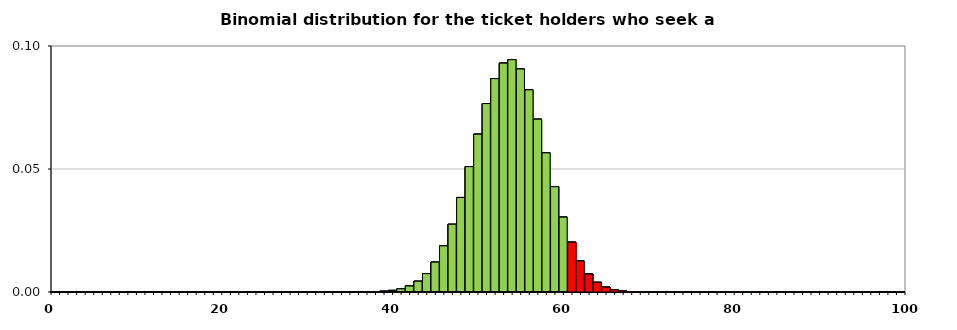
| Category | get their parking lot | 0,670 | 80 | 0,048 |
|---|---|---|---|---|
| 0.0 | 0 | 0 | 0 | -1 |
| 1.0 | 0 | 0 | 0 | -1 |
| 2.0 | 0 | 0 | 0 | -1 |
| 3.0 | 0 | 0 | 0 | -1 |
| 4.0 | 0 | 0 | 0 | -1 |
| 5.0 | 0 | 0 | 0 | -1 |
| 6.0 | 0 | 0 | 0 | -1 |
| 7.0 | 0 | 0 | 0 | -1 |
| 8.0 | 0 | 0 | 0 | -1 |
| 9.0 | 0 | 0 | 0 | -1 |
| 10.0 | 0 | 0 | 0 | -1 |
| 11.0 | 0 | 0 | 0 | -1 |
| 12.0 | 0 | 0 | 0 | -1 |
| 13.0 | 0 | 0 | 0 | -1 |
| 14.0 | 0 | 0 | 0 | -1 |
| 15.0 | 0 | 0 | 0 | -1 |
| 16.0 | 0 | 0 | 0 | -1 |
| 17.0 | 0 | 0 | 0 | -1 |
| 18.0 | 0 | 0 | 0 | -1 |
| 19.0 | 0 | 0 | 0 | -1 |
| 20.0 | 0 | 0 | 0 | -1 |
| 21.0 | 0 | 0 | 0 | -1 |
| 22.0 | 0 | 0 | 0 | -1 |
| 23.0 | 0 | 0 | 0 | -1 |
| 24.0 | 0 | 0 | 0 | -1 |
| 25.0 | 0 | 0 | 0 | -1 |
| 26.0 | 0 | 0 | 0 | -1 |
| 27.0 | 0 | 0 | 0 | -1 |
| 28.0 | 0 | 0 | 0 | -1 |
| 29.0 | 0 | 0 | 0 | -1 |
| 30.0 | 0 | 0 | 0 | -1 |
| 31.0 | 0 | 0 | 0 | -1 |
| 32.0 | 0 | 0 | 0 | -1 |
| 33.0 | 0 | 0 | 0 | -1 |
| 34.0 | 0 | 0 | 0 | -1 |
| 35.0 | 0 | 0 | 0 | -1 |
| 36.0 | 0 | 0 | 0 | -1 |
| 37.0 | 0 | 0 | 0 | -1 |
| 38.0 | 0 | 0 | 0 | -1 |
| 39.0 | 0 | 0 | 0 | -1 |
| 40.0 | 0.001 | 0 | 0 | -1 |
| 41.0 | 0.001 | 0 | 0 | -1 |
| 42.0 | 0.002 | 0 | 0 | -1 |
| 43.0 | 0.004 | 0 | 0 | -1 |
| 44.0 | 0.007 | 0 | 0 | -1 |
| 45.0 | 0.012 | 0 | 0 | -1 |
| 46.0 | 0.019 | 0 | 0 | -1 |
| 47.0 | 0.028 | 0 | 0 | -1 |
| 48.0 | 0.038 | 0 | 0 | -1 |
| 49.0 | 0.051 | 0 | 0 | -1 |
| 50.0 | 0.064 | 0 | 0 | -1 |
| 51.0 | 0.077 | 0 | 0 | -1 |
| 52.0 | 0.087 | 0 | 0 | -1 |
| 53.0 | 0.093 | 0 | 0 | -1 |
| 54.0 | 0.094 | 0 | 0 | -1 |
| 55.0 | 0.091 | 0 | 0 | -1 |
| 56.0 | 0.082 | 0 | 0 | -1 |
| 57.0 | 0.07 | 0 | 0 | -1 |
| 58.0 | 0.057 | 0 | 0 | -1 |
| 59.0 | 0.043 | 0 | 0 | -1 |
| 60.0 | 0.03 | 0 | 0 | -1 |
| 61.0 | -1 | 0 | 0 | 0.02 |
| 62.0 | -1 | 0 | 0 | 0.013 |
| 63.0 | -1 | 0 | 0 | 0.007 |
| 64.0 | -1 | 0 | 0 | 0.004 |
| 65.0 | -1 | 0 | 0 | 0.002 |
| 66.0 | -1 | 0 | 0 | 0.001 |
| 67.0 | -1 | 0 | 0 | 0 |
| 68.0 | -1 | 0 | 0 | 0 |
| 69.0 | -1 | 0 | 0 | 0 |
| 70.0 | -1 | 0 | 0 | 0 |
| 71.0 | -1 | 0 | 0 | 0 |
| 72.0 | -1 | 0 | 0 | 0 |
| 73.0 | -1 | 0 | 0 | 0 |
| 74.0 | -1 | 0 | 0 | 0 |
| 75.0 | -1 | 0 | 0 | 0 |
| 76.0 | -1 | 0 | 0 | 0 |
| 77.0 | -1 | 0 | 0 | 0 |
| 78.0 | -1 | 0 | 0 | 0 |
| 79.0 | -1 | 0 | 0 | 0 |
| 80.0 | -1 | 0 | 0 | 0 |
| 81.0 | -1 | 0 | 0 | 0 |
| 82.0 | -1 | 0 | 0 | 0 |
| 83.0 | -1 | 0 | 0 | 0 |
| 84.0 | -1 | 0 | 0 | 0 |
| 85.0 | -1 | 0 | 0 | 0 |
| 86.0 | -1 | 0 | 0 | 0 |
| 87.0 | -1 | 0 | 0 | 0 |
| 88.0 | -1 | 0 | 0 | 0 |
| 89.0 | -1 | 0 | 0 | 0 |
| 90.0 | -1 | 0 | 0 | 0 |
| 91.0 | -1 | 0 | 0 | 0 |
| 92.0 | -1 | 0 | 0 | 0 |
| 93.0 | -1 | 0 | 0 | 0 |
| 94.0 | -1 | 0 | 0 | 0 |
| 95.0 | -1 | 0 | 0 | 0 |
| 96.0 | -1 | 0 | 0 | 0 |
| 97.0 | -1 | 0 | 0 | 0 |
| 98.0 | -1 | 0 | 0 | 0 |
| 99.0 | -1 | 0 | 0 | 0 |
| 100.0 | -1 | 0 | 0 | 0 |